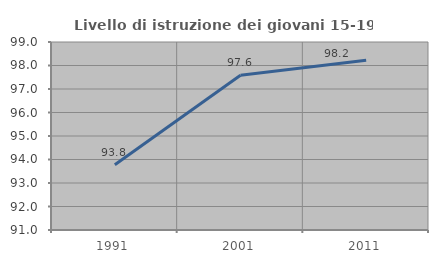
| Category | Livello di istruzione dei giovani 15-19 anni |
|---|---|
| 1991.0 | 93.775 |
| 2001.0 | 97.582 |
| 2011.0 | 98.221 |